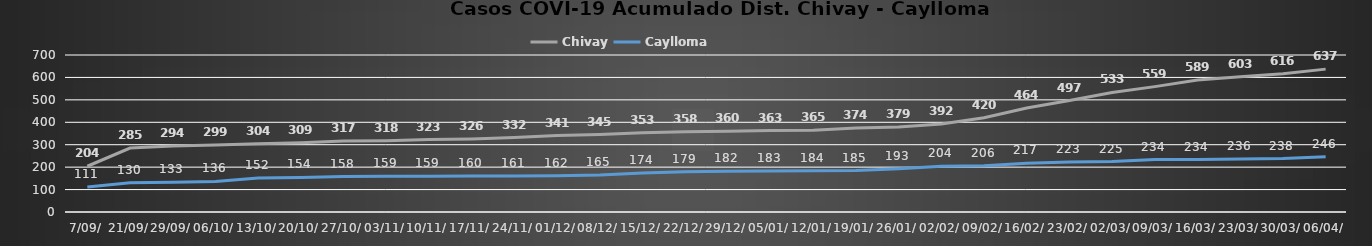
| Category | Chivay | Caylloma |
|---|---|---|
| 7/09/ | 204 | 111 |
| 21/09/ | 285 | 130 |
| 29/09/ | 294 | 133 |
| 06/10/ | 299 | 136 |
| 13/10/ | 304 | 152 |
| 20/10/ | 309 | 154 |
| 27/10/ | 317 | 158 |
| 03/11/ | 318 | 159 |
| 10/11/ | 323 | 159 |
| 17/11/ | 326 | 160 |
| 24/11/ | 332 | 161 |
| 01/12/ | 341 | 162 |
| 08/12/ | 345 | 165 |
| 15/12/ | 353 | 174 |
| 22/12/ | 358 | 179 |
| 29/12/ | 360 | 182 |
| 05/01/ | 363 | 183 |
| 12/01/ | 365 | 184 |
| 19/01/ | 374 | 185 |
| 26/01/ | 379 | 193 |
| 02/02/ | 392 | 204 |
| 09/02/ | 420 | 206 |
| 16/02/ | 464 | 217 |
| 23/02/ | 497 | 223 |
| 02/03/ | 533 | 225 |
| 09/03/ | 559 | 234 |
| 16/03/ | 589 | 234 |
| 23/03/ | 603 | 236 |
| 30/03/ | 616 | 238 |
| 06/04/ | 637 | 246 |